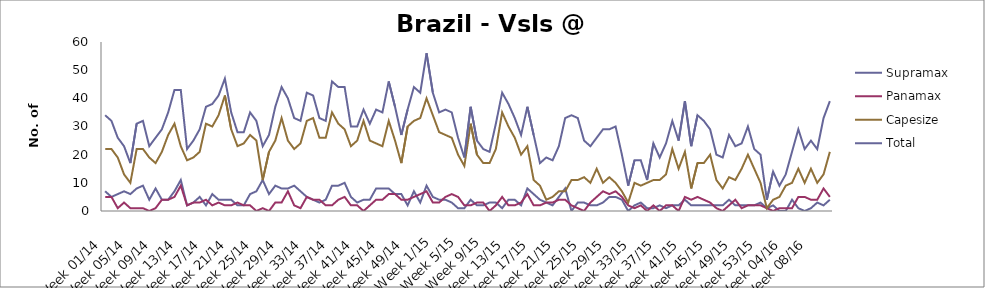
| Category | Supramax | Panamax | Capesize | Total |
|---|---|---|---|---|
| Week 01/14 | 7 | 5 | 22 | 34 |
| Week 02/14 | 5 | 5 | 22 | 32 |
| Week 03/14 | 6 | 1 | 19 | 26 |
| Week 04/14 | 7 | 3 | 13 | 23 |
| Week 05/14 | 6 | 1 | 10 | 17 |
| Week 06/14 | 8 | 1 | 22 | 31 |
| Week 07/14 | 9 | 1 | 22 | 32 |
| Week 08/14 | 4 | 0 | 19 | 23 |
| Week 09/14 | 8 | 1 | 17 | 26 |
| Week 10/14 | 4 | 4 | 21 | 29 |
| Week 11/14 | 4 | 4 | 27 | 35 |
| Week 12/14 | 7 | 5 | 31 | 43 |
| Week 13/14 | 11 | 9 | 23 | 43 |
| Week 14/14 | 2 | 2 | 18 | 22 |
| Week 15/14 | 3 | 3 | 19 | 25 |
| Week 16/14 | 5 | 3 | 21 | 29 |
| Week 17/14 | 2 | 4 | 31 | 37 |
| Week 18/14 | 6 | 2 | 30 | 38 |
| Week 19/14 | 4 | 3 | 34 | 41 |
| Week 20/14 | 4 | 2 | 41 | 47 |
| Week 21/14 | 4 | 2 | 29 | 35 |
| Week 22/14 | 2 | 3 | 23 | 28 |
| Week 23/14 | 2 | 2 | 24 | 28 |
| Week 24/14 | 6 | 2 | 27 | 35 |
| Week 25/14 | 7 | 0 | 25 | 32 |
| Week 26/14 | 11 | 1 | 11 | 23 |
| Week 27/14 | 6 | 0 | 21 | 27 |
| Week 28/14 | 9 | 3 | 25 | 37 |
| Week 29/14 | 8 | 3 | 33 | 44 |
| Week 30/14 | 8 | 7 | 25 | 40 |
| Week 31/14 | 9 | 2 | 22 | 33 |
| Week 32/14 | 7 | 1 | 24 | 32 |
| Week 33/14 | 5 | 5 | 32 | 42 |
| Week 34/14 | 4 | 4 | 33 | 41 |
| Week 35/14 | 3 | 4 | 26 | 33 |
| Week 36/14 | 4 | 2 | 26 | 32 |
| Week 37/14 | 9 | 2 | 35 | 46 |
| Week 38/14 | 9 | 4 | 31 | 44 |
| Week 39/14 | 10 | 5 | 29 | 44 |
| Week 40/14 | 5 | 2 | 23 | 30 |
| Week 41/14 | 3 | 2 | 25 | 30 |
| Week 42/14 | 4 | 0 | 32 | 36 |
| Week 43/14 | 4 | 2 | 25 | 31 |
| Week 44/14 | 8 | 4 | 24 | 36 |
| Week 45/14 | 8 | 4 | 23 | 35 |
| Week 46/14 | 8 | 6 | 32 | 46 |
| Week 47/14 | 6 | 6 | 25 | 37 |
| Week 48/14 | 6 | 4 | 17 | 27 |
| Week 49/14 | 2 | 4 | 30 | 36 |
| Week 50/14 | 7 | 5 | 32 | 44 |
| Week 51/14 | 3 | 6 | 33 | 42 |
| Week 52/14 | 9 | 7 | 40 | 56 |
| Week 1/15 | 5 | 3 | 34 | 42 |
| Week 2/15 | 4 | 3 | 28 | 35 |
| Week 3/15 | 4 | 5 | 27 | 36 |
| Week 4/15 | 3 | 6 | 26 | 35 |
| Week 5/15 | 1 | 5 | 20 | 26 |
| Week 6/15 | 1 | 2 | 16 | 19 |
| Week 7/15 | 4 | 2 | 31 | 37 |
| Week 8/15 | 2 | 3 | 20 | 25 |
| Week 9/15 | 2 | 3 | 17 | 22 |
| Week 10/15 | 3 | 0 | 17 | 21 |
| Week 11/15 | 3 | 2 | 22 | 31 |
| Week 12/15 | 1 | 5 | 35 | 42 |
| Week 13/15 | 4 | 2 | 30 | 38 |
| Week 14/15 | 4 | 2 | 26 | 33 |
| Week 15/15 | 2 | 3 | 20 | 27 |
| Week 16/15 | 8 | 6 | 23 | 37 |
| Week 17/15 | 6 | 2 | 11 | 27 |
| Week 18/15 | 4 | 2 | 9 | 17 |
| Week 19/15 | 3 | 3 | 4 | 19 |
| Week 20/15 | 2 | 3 | 5 | 18 |
| Week 21/15 | 5 | 4 | 7 | 23 |
| Week 22/15 | 8 | 4 | 7 | 33 |
| Week 23/15 | 0 | 2 | 11 | 34 |
| Week 24/15 | 3 | 1 | 11 | 33 |
| Week 25/15 | 3 | 0 | 12 | 25 |
| Week 26/15 | 2 | 3 | 10 | 23 |
| Week 27/15 | 2 | 5 | 15 | 26 |
| Week 28/15 | 3 | 7 | 10 | 29 |
| Week 29/15 | 5 | 6 | 12 | 29 |
| Week 30/15 | 5 | 7 | 10 | 30 |
| Week 31/15 | 4 | 5 | 7 | 20 |
| Week 32/15 | 0 | 2 | 3 | 9 |
| Week 33/15 | 2 | 1 | 10 | 18 |
| Week 34/15 | 3 | 2 | 9 | 18 |
| Week 35/15 | 1 | 0 | 10 | 11 |
| Week 36/15 | 1 | 2 | 11 | 24 |
| Week 37/15 | 2 | 0 | 11 | 19 |
| Week 38/15 | 1 | 2 | 13 | 24 |
| Week 39/15 | 2 | 2 | 22 | 32 |
| Week 40/15 | 2 | 0 | 15 | 25 |
| Week 41/15 | 4 | 5 | 21 | 39 |
| Week 42/15 | 2 | 4 | 8 | 23 |
| Week 43/15 | 2 | 5 | 17 | 34 |
| Week 44/15 | 2 | 4 | 17 | 32 |
| Week 45/15 | 2 | 3 | 20 | 29 |
| Week 46/15 | 2 | 1 | 11 | 20 |
| Week 47/15 | 2 | 0 | 8 | 19 |
| Week 48/15 | 4 | 2 | 12 | 27 |
| Week 49/15 | 2 | 4 | 11 | 23 |
| Week 50/15 | 2 | 1 | 15 | 24 |
| Week 51/15 | 2 | 2 | 20 | 30 |
| Week 52/15 | 2 | 2 | 15 | 22 |
| Week 53/15 | 3 | 2 | 10 | 20 |
| Week 01/16 | 1 | 1 | 1 | 4 |
| Week 02/16 | 2 | 0 | 4 | 14 |
| Week 03/16 | 0 | 1 | 5 | 9 |
| Week 04/16 | 0 | 1 | 9 | 13 |
| Week 05/16 | 4 | 1 | 10 | 21 |
| Week 06/16 | 1 | 5 | 15 | 29 |
| Week 07/16 | 0 | 5 | 10 | 22 |
| Week 08/16 | 1 | 4 | 15 | 25 |
| Week 09/16 | 3 | 4 | 10 | 22 |
| Week 10/16 | 2 | 8 | 13 | 33 |
| Week 11/16 | 4 | 5 | 21 | 39 |